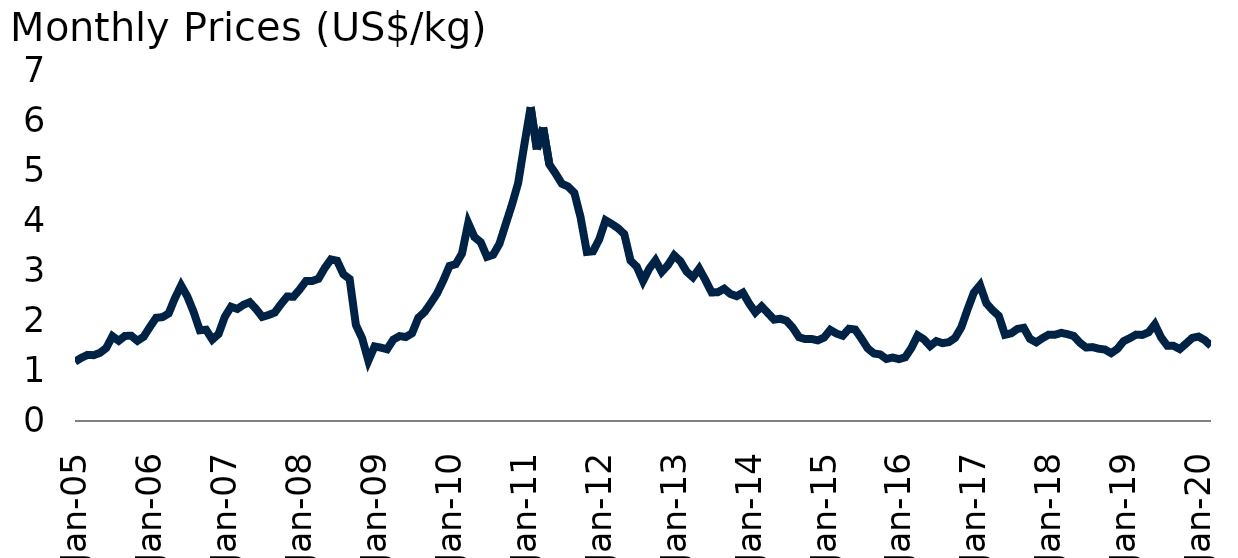
| Category | Rubber |
|---|---|
| 2005-01-01 | 1.183 |
| 2005-02-01 | 1.259 |
| 2005-03-01 | 1.318 |
| 2005-04-01 | 1.313 |
| 2005-05-01 | 1.359 |
| 2005-06-01 | 1.455 |
| 2005-07-01 | 1.692 |
| 2005-08-01 | 1.6 |
| 2005-09-01 | 1.696 |
| 2005-10-01 | 1.701 |
| 2005-11-01 | 1.599 |
| 2005-12-01 | 1.68 |
| 2006-01-01 | 1.875 |
| 2006-02-01 | 2.058 |
| 2006-03-01 | 2.071 |
| 2006-04-01 | 2.143 |
| 2006-05-01 | 2.447 |
| 2006-06-01 | 2.703 |
| 2006-07-01 | 2.483 |
| 2006-08-01 | 2.176 |
| 2006-09-01 | 1.809 |
| 2006-10-01 | 1.82 |
| 2006-11-01 | 1.624 |
| 2006-12-01 | 1.735 |
| 2007-01-01 | 2.078 |
| 2007-02-01 | 2.279 |
| 2007-03-01 | 2.235 |
| 2007-04-01 | 2.318 |
| 2007-05-01 | 2.369 |
| 2007-06-01 | 2.234 |
| 2007-07-01 | 2.076 |
| 2007-08-01 | 2.113 |
| 2007-09-01 | 2.162 |
| 2007-10-01 | 2.332 |
| 2007-11-01 | 2.483 |
| 2007-12-01 | 2.478 |
| 2008-01-01 | 2.624 |
| 2008-02-01 | 2.79 |
| 2008-03-01 | 2.792 |
| 2008-04-01 | 2.835 |
| 2008-05-01 | 3.048 |
| 2008-06-01 | 3.222 |
| 2008-07-01 | 3.195 |
| 2008-08-01 | 2.926 |
| 2008-09-01 | 2.831 |
| 2008-10-01 | 1.916 |
| 2008-11-01 | 1.651 |
| 2008-12-01 | 1.203 |
| 2009-01-01 | 1.487 |
| 2009-02-01 | 1.463 |
| 2009-03-01 | 1.431 |
| 2009-04-01 | 1.624 |
| 2009-05-01 | 1.693 |
| 2009-06-01 | 1.675 |
| 2009-07-01 | 1.749 |
| 2009-08-01 | 2.059 |
| 2009-09-01 | 2.172 |
| 2009-10-01 | 2.352 |
| 2009-11-01 | 2.542 |
| 2009-12-01 | 2.801 |
| 2010-01-01 | 3.092 |
| 2010-02-01 | 3.127 |
| 2010-03-01 | 3.339 |
| 2010-04-01 | 3.948 |
| 2010-05-01 | 3.668 |
| 2010-06-01 | 3.566 |
| 2010-07-01 | 3.274 |
| 2010-08-01 | 3.316 |
| 2010-09-01 | 3.533 |
| 2010-10-01 | 3.925 |
| 2010-11-01 | 4.312 |
| 2010-12-01 | 4.746 |
| 2011-01-01 | 5.52 |
| 2011-02-01 | 6.259 |
| 2011-03-01 | 5.419 |
| 2011-04-01 | 5.853 |
| 2011-05-01 | 5.116 |
| 2011-06-01 | 4.934 |
| 2011-07-01 | 4.732 |
| 2011-08-01 | 4.676 |
| 2011-09-01 | 4.552 |
| 2011-10-01 | 4.061 |
| 2011-11-01 | 3.372 |
| 2011-12-01 | 3.384 |
| 2012-01-01 | 3.626 |
| 2012-02-01 | 4.003 |
| 2012-03-01 | 3.929 |
| 2012-04-01 | 3.845 |
| 2012-05-01 | 3.728 |
| 2012-06-01 | 3.199 |
| 2012-07-01 | 3.078 |
| 2012-08-01 | 2.793 |
| 2012-09-01 | 3.038 |
| 2012-10-01 | 3.204 |
| 2012-11-01 | 2.974 |
| 2012-12-01 | 3.11 |
| 2013-01-01 | 3.304 |
| 2013-02-01 | 3.186 |
| 2013-03-01 | 2.977 |
| 2013-04-01 | 2.867 |
| 2013-05-01 | 3.038 |
| 2013-06-01 | 2.81 |
| 2013-07-01 | 2.563 |
| 2013-08-01 | 2.569 |
| 2013-09-01 | 2.638 |
| 2013-10-01 | 2.534 |
| 2013-11-01 | 2.49 |
| 2013-12-01 | 2.558 |
| 2014-01-01 | 2.345 |
| 2014-02-01 | 2.166 |
| 2014-03-01 | 2.285 |
| 2014-04-01 | 2.154 |
| 2014-05-01 | 2.022 |
| 2014-06-01 | 2.039 |
| 2014-07-01 | 1.999 |
| 2014-08-01 | 1.86 |
| 2014-09-01 | 1.67 |
| 2014-10-01 | 1.633 |
| 2014-11-01 | 1.637 |
| 2014-12-01 | 1.608 |
| 2015-01-01 | 1.663 |
| 2015-02-01 | 1.817 |
| 2015-03-01 | 1.744 |
| 2015-04-01 | 1.7 |
| 2015-05-01 | 1.839 |
| 2015-06-01 | 1.824 |
| 2015-07-01 | 1.642 |
| 2015-08-01 | 1.449 |
| 2015-09-01 | 1.347 |
| 2015-10-01 | 1.328 |
| 2015-11-01 | 1.237 |
| 2015-12-01 | 1.266 |
| 2016-01-01 | 1.234 |
| 2016-02-01 | 1.27 |
| 2016-03-01 | 1.456 |
| 2016-04-01 | 1.707 |
| 2016-05-01 | 1.629 |
| 2016-06-01 | 1.494 |
| 2016-07-01 | 1.593 |
| 2016-08-01 | 1.552 |
| 2016-09-01 | 1.573 |
| 2016-10-01 | 1.658 |
| 2016-11-01 | 1.871 |
| 2016-12-01 | 2.226 |
| 2017-01-01 | 2.558 |
| 2017-02-01 | 2.709 |
| 2017-03-01 | 2.35 |
| 2017-04-01 | 2.21 |
| 2017-05-01 | 2.097 |
| 2017-06-01 | 1.72 |
| 2017-07-01 | 1.749 |
| 2017-08-01 | 1.837 |
| 2017-09-01 | 1.858 |
| 2017-10-01 | 1.637 |
| 2017-11-01 | 1.569 |
| 2017-12-01 | 1.652 |
| 2018-01-01 | 1.722 |
| 2018-02-01 | 1.72 |
| 2018-03-01 | 1.758 |
| 2018-04-01 | 1.732 |
| 2018-05-01 | 1.696 |
| 2018-06-01 | 1.56 |
| 2018-07-01 | 1.465 |
| 2018-08-01 | 1.474 |
| 2018-09-01 | 1.442 |
| 2018-10-01 | 1.425 |
| 2018-11-01 | 1.353 |
| 2018-12-01 | 1.436 |
| 2019-01-01 | 1.592 |
| 2019-02-01 | 1.653 |
| 2019-03-01 | 1.722 |
| 2019-04-01 | 1.717 |
| 2019-05-01 | 1.769 |
| 2019-06-01 | 1.927 |
| 2019-07-01 | 1.668 |
| 2019-08-01 | 1.5 |
| 2019-09-01 | 1.499 |
| 2019-10-01 | 1.435 |
| 2019-11-01 | 1.544 |
| 2019-12-01 | 1.658 |
| 2020-01-01 | 1.683 |
| 2020-02-01 | 1.613 |
| 2020-03-01 | 1.499 |